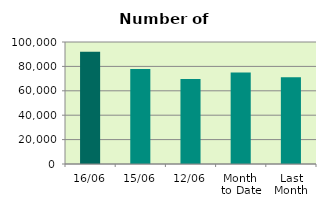
| Category | Series 0 |
|---|---|
| 16/06 | 92062 |
| 15/06 | 77792 |
| 12/06 | 69580 |
| Month 
to Date | 74990.167 |
| Last
Month | 71072.3 |